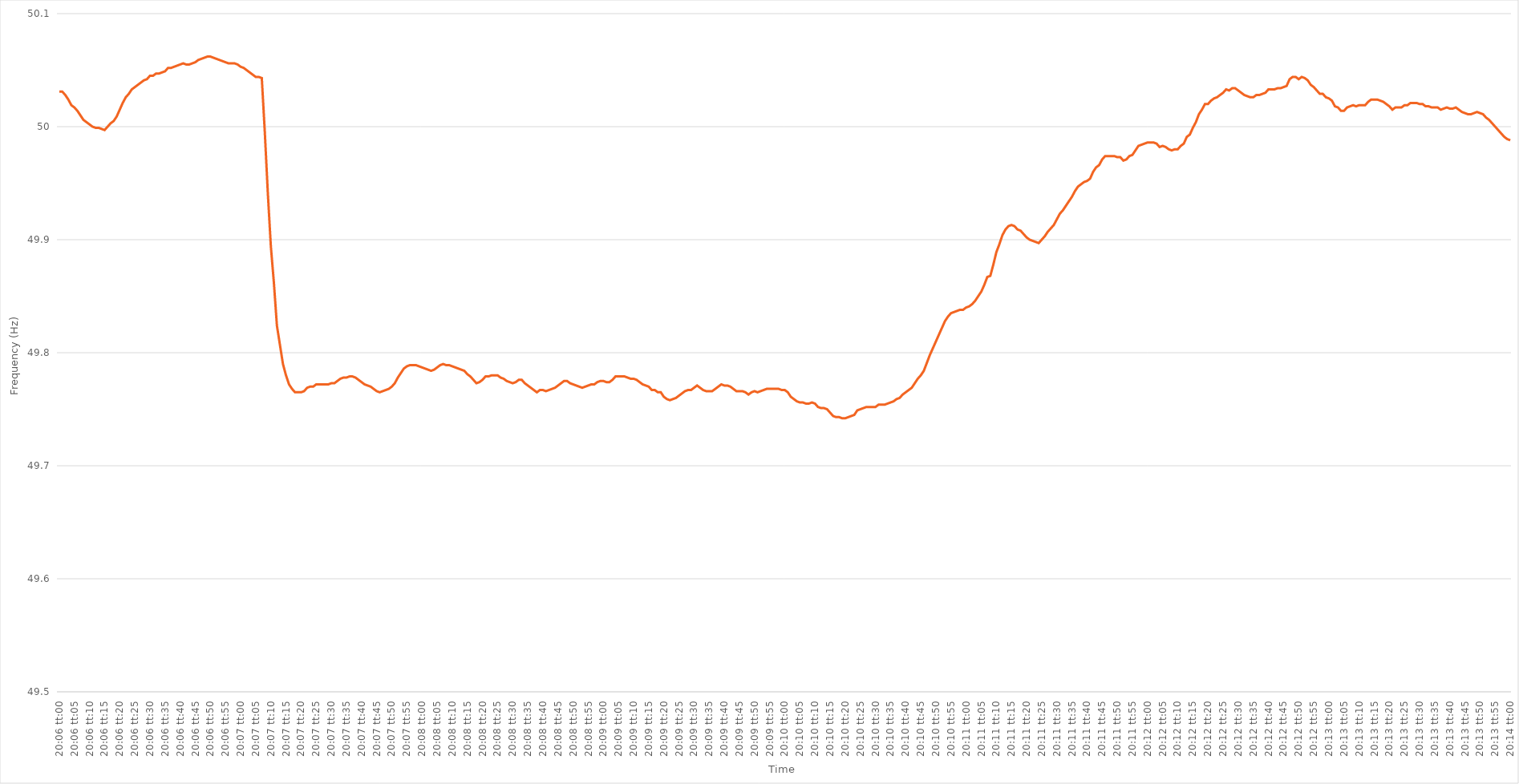
| Category | Series 0 |
|---|---|
| 0.8375 | 50.031 |
| 0.8375115740740741 | 50.031 |
| 0.8375231481481481 | 50.028 |
| 0.8375347222222222 | 50.024 |
| 0.8375462962962964 | 50.019 |
| 0.8375578703703703 | 50.017 |
| 0.8375694444444445 | 50.014 |
| 0.8375810185185185 | 50.01 |
| 0.8375925925925927 | 50.006 |
| 0.8376041666666666 | 50.004 |
| 0.8376157407407407 | 50.002 |
| 0.8376273148148149 | 50 |
| 0.8376388888888888 | 49.999 |
| 0.837650462962963 | 49.999 |
| 0.837662037037037 | 49.998 |
| 0.8376736111111112 | 49.997 |
| 0.8376851851851851 | 50 |
| 0.8376967592592592 | 50.003 |
| 0.8377083333333334 | 50.005 |
| 0.8377199074074074 | 50.009 |
| 0.8377314814814815 | 50.015 |
| 0.8377430555555555 | 50.021 |
| 0.8377546296296297 | 50.026 |
| 0.8377662037037038 | 50.029 |
| 0.8377777777777777 | 50.033 |
| 0.8377893518518519 | 50.035 |
| 0.8378009259259259 | 50.037 |
| 0.8378125000000001 | 50.039 |
| 0.837824074074074 | 50.041 |
| 0.8378356481481481 | 50.042 |
| 0.8378472222222223 | 50.045 |
| 0.8378587962962962 | 50.045 |
| 0.8378703703703704 | 50.047 |
| 0.8378819444444444 | 50.047 |
| 0.8378935185185186 | 50.048 |
| 0.8379050925925925 | 50.049 |
| 0.8379166666666666 | 50.052 |
| 0.8379282407407408 | 50.052 |
| 0.8379398148148148 | 50.053 |
| 0.8379513888888889 | 50.054 |
| 0.8379629629629629 | 50.055 |
| 0.8379745370370371 | 50.056 |
| 0.8379861111111112 | 50.055 |
| 0.8379976851851851 | 50.055 |
| 0.8380092592592593 | 50.056 |
| 0.8380208333333333 | 50.057 |
| 0.8380324074074075 | 50.059 |
| 0.8380439814814814 | 50.06 |
| 0.8380555555555556 | 50.061 |
| 0.8380671296296297 | 50.062 |
| 0.8380787037037036 | 50.062 |
| 0.8380902777777778 | 50.061 |
| 0.8381018518518518 | 50.06 |
| 0.838113425925926 | 50.059 |
| 0.8381249999999999 | 50.058 |
| 0.838136574074074 | 50.057 |
| 0.8381481481481482 | 50.056 |
| 0.8381597222222222 | 50.056 |
| 0.8381712962962963 | 50.056 |
| 0.8381828703703703 | 50.055 |
| 0.8381944444444445 | 50.053 |
| 0.8382060185185186 | 50.052 |
| 0.8382175925925925 | 50.05 |
| 0.8382291666666667 | 50.048 |
| 0.8382407407407407 | 50.046 |
| 0.8382523148148149 | 50.044 |
| 0.8382638888888888 | 50.044 |
| 0.838275462962963 | 50.043 |
| 0.8382870370370371 | 49.995 |
| 0.8382986111111111 | 49.941 |
| 0.8383101851851852 | 49.894 |
| 0.8383217592592592 | 49.862 |
| 0.8383333333333334 | 49.824 |
| 0.8383449074074073 | 49.807 |
| 0.8383564814814815 | 49.79 |
| 0.8383680555555556 | 49.78 |
| 0.8383796296296296 | 49.772 |
| 0.8383912037037037 | 49.768 |
| 0.8384027777777777 | 49.765 |
| 0.8384143518518519 | 49.765 |
| 0.838425925925926 | 49.765 |
| 0.8384375 | 49.766 |
| 0.8384490740740741 | 49.769 |
| 0.8384606481481481 | 49.77 |
| 0.8384722222222223 | 49.77 |
| 0.8384837962962962 | 49.772 |
| 0.8384953703703704 | 49.772 |
| 0.8385069444444445 | 49.772 |
| 0.8385185185185186 | 49.772 |
| 0.8385300925925926 | 49.772 |
| 0.8385416666666666 | 49.773 |
| 0.8385532407407408 | 49.773 |
| 0.8385648148148147 | 49.775 |
| 0.8385763888888889 | 49.777 |
| 0.838587962962963 | 49.778 |
| 0.838599537037037 | 49.778 |
| 0.8386111111111111 | 49.779 |
| 0.8386226851851851 | 49.779 |
| 0.8386342592592593 | 49.778 |
| 0.8386458333333334 | 49.776 |
| 0.8386574074074074 | 49.774 |
| 0.8386689814814815 | 49.772 |
| 0.8386805555555555 | 49.771 |
| 0.8386921296296297 | 49.77 |
| 0.8387037037037036 | 49.768 |
| 0.8387152777777778 | 49.766 |
| 0.8387268518518519 | 49.765 |
| 0.838738425925926 | 49.766 |
| 0.83875 | 49.767 |
| 0.838761574074074 | 49.768 |
| 0.8387731481481482 | 49.77 |
| 0.8387847222222221 | 49.773 |
| 0.8387962962962963 | 49.778 |
| 0.8388078703703704 | 49.782 |
| 0.8388194444444445 | 49.786 |
| 0.8388310185185185 | 49.788 |
| 0.8388425925925925 | 49.789 |
| 0.8388541666666667 | 49.789 |
| 0.8388657407407408 | 49.789 |
| 0.8388773148148148 | 49.788 |
| 0.8388888888888889 | 49.787 |
| 0.838900462962963 | 49.786 |
| 0.8389120370370371 | 49.785 |
| 0.838923611111111 | 49.784 |
| 0.8389351851851852 | 49.785 |
| 0.8389467592592593 | 49.787 |
| 0.8389583333333334 | 49.789 |
| 0.8389699074074074 | 49.79 |
| 0.8389814814814814 | 49.789 |
| 0.8389930555555556 | 49.789 |
| 0.8390046296296297 | 49.788 |
| 0.8390162037037037 | 49.787 |
| 0.8390277777777778 | 49.786 |
| 0.8390393518518519 | 49.785 |
| 0.8390509259259259 | 49.784 |
| 0.8390624999999999 | 49.781 |
| 0.8390740740740741 | 49.779 |
| 0.8390856481481482 | 49.776 |
| 0.8390972222222222 | 49.773 |
| 0.8391087962962963 | 49.774 |
| 0.8391203703703703 | 49.776 |
| 0.8391319444444445 | 49.779 |
| 0.8391435185185184 | 49.779 |
| 0.8391550925925926 | 49.78 |
| 0.8391666666666667 | 49.78 |
| 0.8391782407407408 | 49.78 |
| 0.8391898148148148 | 49.778 |
| 0.8392013888888888 | 49.777 |
| 0.839212962962963 | 49.775 |
| 0.8392245370370371 | 49.774 |
| 0.8392361111111111 | 49.773 |
| 0.8392476851851852 | 49.774 |
| 0.8392592592592593 | 49.776 |
| 0.8392708333333333 | 49.776 |
| 0.8392824074074073 | 49.773 |
| 0.8392939814814815 | 49.771 |
| 0.8393055555555556 | 49.769 |
| 0.8393171296296296 | 49.767 |
| 0.8393287037037037 | 49.765 |
| 0.8393402777777778 | 49.767 |
| 0.8393518518518519 | 49.767 |
| 0.8393634259259258 | 49.766 |
| 0.839375 | 49.767 |
| 0.8393865740740741 | 49.768 |
| 0.8393981481481482 | 49.769 |
| 0.8394097222222222 | 49.771 |
| 0.8394212962962962 | 49.773 |
| 0.8394328703703704 | 49.775 |
| 0.8394444444444445 | 49.775 |
| 0.8394560185185185 | 49.773 |
| 0.8394675925925926 | 49.772 |
| 0.8394791666666667 | 49.771 |
| 0.8394907407407407 | 49.77 |
| 0.8395023148148147 | 49.769 |
| 0.8395138888888889 | 49.77 |
| 0.839525462962963 | 49.771 |
| 0.839537037037037 | 49.772 |
| 0.8395486111111111 | 49.772 |
| 0.8395601851851852 | 49.774 |
| 0.8395717592592593 | 49.775 |
| 0.8395833333333332 | 49.775 |
| 0.8395949074074074 | 49.774 |
| 0.8396064814814815 | 49.774 |
| 0.8396180555555556 | 49.776 |
| 0.8396296296296296 | 49.779 |
| 0.8396412037037037 | 49.779 |
| 0.8396527777777778 | 49.779 |
| 0.839664351851852 | 49.779 |
| 0.8396759259259259 | 49.778 |
| 0.8396875 | 49.777 |
| 0.8396990740740741 | 49.777 |
| 0.8397106481481482 | 49.776 |
| 0.8397222222222221 | 49.774 |
| 0.8397337962962963 | 49.772 |
| 0.8397453703703704 | 49.771 |
| 0.8397569444444444 | 49.77 |
| 0.8397685185185185 | 49.767 |
| 0.8397800925925926 | 49.767 |
| 0.8397916666666667 | 49.765 |
| 0.8398032407407406 | 49.765 |
| 0.8398148148148148 | 49.761 |
| 0.8398263888888889 | 49.759 |
| 0.839837962962963 | 49.758 |
| 0.839849537037037 | 49.759 |
| 0.8398611111111111 | 49.76 |
| 0.8398726851851852 | 49.762 |
| 0.8398842592592594 | 49.764 |
| 0.8398958333333333 | 49.766 |
| 0.8399074074074074 | 49.767 |
| 0.8399189814814815 | 49.767 |
| 0.8399305555555556 | 49.769 |
| 0.8399421296296296 | 49.771 |
| 0.8399537037037037 | 49.769 |
| 0.8399652777777779 | 49.767 |
| 0.8399768518518518 | 49.766 |
| 0.8399884259259259 | 49.766 |
| 0.84 | 49.766 |
| 0.8400115740740741 | 49.768 |
| 0.840023148148148 | 49.77 |
| 0.8400347222222222 | 49.772 |
| 0.8400462962962963 | 49.771 |
| 0.8400578703703704 | 49.771 |
| 0.8400694444444444 | 49.77 |
| 0.8400810185185185 | 49.768 |
| 0.8400925925925926 | 49.766 |
| 0.8401041666666668 | 49.766 |
| 0.8401157407407407 | 49.766 |
| 0.8401273148148148 | 49.765 |
| 0.8401388888888889 | 49.763 |
| 0.840150462962963 | 49.765 |
| 0.840162037037037 | 49.766 |
| 0.8401736111111111 | 49.765 |
| 0.8401851851851853 | 49.766 |
| 0.8401967592592593 | 49.767 |
| 0.8402083333333333 | 49.768 |
| 0.8402199074074074 | 49.768 |
| 0.8402314814814815 | 49.768 |
| 0.8402430555555555 | 49.768 |
| 0.8402546296296296 | 49.768 |
| 0.8402662037037038 | 49.767 |
| 0.8402777777777778 | 49.767 |
| 0.8402893518518518 | 49.765 |
| 0.8403009259259259 | 49.761 |
| 0.8403125 | 49.759 |
| 0.8403240740740742 | 49.757 |
| 0.8403356481481481 | 49.756 |
| 0.8403472222222222 | 49.756 |
| 0.8403587962962963 | 49.755 |
| 0.8403703703703704 | 49.755 |
| 0.8403819444444444 | 49.756 |
| 0.8403935185185185 | 49.755 |
| 0.8404050925925927 | 49.752 |
| 0.8404166666666667 | 49.751 |
| 0.8404282407407407 | 49.751 |
| 0.8404398148148148 | 49.75 |
| 0.8404513888888889 | 49.747 |
| 0.8404629629629629 | 49.744 |
| 0.840474537037037 | 49.743 |
| 0.8404861111111112 | 49.743 |
| 0.8404976851851852 | 49.742 |
| 0.8405092592592592 | 49.742 |
| 0.8405208333333333 | 49.743 |
| 0.8405324074074074 | 49.744 |
| 0.8405439814814816 | 49.745 |
| 0.8405555555555555 | 49.749 |
| 0.8405671296296297 | 49.75 |
| 0.8405787037037037 | 49.751 |
| 0.8405902777777778 | 49.752 |
| 0.8406018518518518 | 49.752 |
| 0.8406134259259259 | 49.752 |
| 0.8406250000000001 | 49.752 |
| 0.8406365740740741 | 49.754 |
| 0.8406481481481481 | 49.754 |
| 0.8406597222222222 | 49.754 |
| 0.8406712962962963 | 49.755 |
| 0.8406828703703703 | 49.756 |
| 0.8406944444444444 | 49.757 |
| 0.8407060185185186 | 49.759 |
| 0.8407175925925926 | 49.76 |
| 0.8407291666666666 | 49.763 |
| 0.8407407407407407 | 49.765 |
| 0.8407523148148148 | 49.767 |
| 0.840763888888889 | 49.769 |
| 0.8407754629629629 | 49.773 |
| 0.840787037037037 | 49.777 |
| 0.8407986111111111 | 49.78 |
| 0.8408101851851852 | 49.784 |
| 0.8408217592592592 | 49.791 |
| 0.8408333333333333 | 49.798 |
| 0.8408449074074075 | 49.804 |
| 0.8408564814814815 | 49.81 |
| 0.8408680555555555 | 49.816 |
| 0.8408796296296296 | 49.822 |
| 0.8408912037037037 | 49.828 |
| 0.8409027777777779 | 49.832 |
| 0.8409143518518518 | 49.835 |
| 0.840925925925926 | 49.836 |
| 0.8409375 | 49.837 |
| 0.840949074074074 | 49.838 |
| 0.8409606481481481 | 49.838 |
| 0.8409722222222222 | 49.84 |
| 0.8409837962962964 | 49.841 |
| 0.8409953703703703 | 49.843 |
| 0.8410069444444445 | 49.846 |
| 0.8410185185185185 | 49.85 |
| 0.8410300925925926 | 49.854 |
| 0.8410416666666666 | 49.86 |
| 0.8410532407407407 | 49.867 |
| 0.8410648148148149 | 49.868 |
| 0.8410763888888889 | 49.878 |
| 0.841087962962963 | 49.889 |
| 0.841099537037037 | 49.896 |
| 0.8411111111111111 | 49.904 |
| 0.8411226851851853 | 49.909 |
| 0.8411342592592592 | 49.912 |
| 0.8411458333333334 | 49.913 |
| 0.8411574074074074 | 49.912 |
| 0.8411689814814814 | 49.909 |
| 0.8411805555555555 | 49.908 |
| 0.8411921296296296 | 49.905 |
| 0.8412037037037038 | 49.902 |
| 0.8412152777777777 | 49.9 |
| 0.8412268518518519 | 49.899 |
| 0.8412384259259259 | 49.898 |
| 0.84125 | 49.897 |
| 0.841261574074074 | 49.9 |
| 0.8412731481481481 | 49.903 |
| 0.8412847222222223 | 49.907 |
| 0.8412962962962963 | 49.91 |
| 0.8413078703703704 | 49.913 |
| 0.8413194444444444 | 49.918 |
| 0.8413310185185185 | 49.923 |
| 0.8413425925925927 | 49.926 |
| 0.8413541666666666 | 49.93 |
| 0.8413657407407408 | 49.934 |
| 0.8413773148148148 | 49.938 |
| 0.8413888888888889 | 49.943 |
| 0.8414004629629629 | 49.947 |
| 0.841412037037037 | 49.949 |
| 0.8414236111111112 | 49.951 |
| 0.8414351851851851 | 49.952 |
| 0.8414467592592593 | 49.954 |
| 0.8414583333333333 | 49.96 |
| 0.8414699074074075 | 49.964 |
| 0.8414814814814814 | 49.966 |
| 0.8414930555555555 | 49.971 |
| 0.8415046296296297 | 49.974 |
| 0.8415162037037037 | 49.974 |
| 0.8415277777777778 | 49.974 |
| 0.8415393518518518 | 49.974 |
| 0.841550925925926 | 49.973 |
| 0.8415625000000001 | 49.973 |
| 0.841574074074074 | 49.97 |
| 0.8415856481481482 | 49.971 |
| 0.8415972222222222 | 49.974 |
| 0.8416087962962964 | 49.975 |
| 0.8416203703703703 | 49.979 |
| 0.8416319444444444 | 49.983 |
| 0.8416435185185186 | 49.984 |
| 0.8416550925925925 | 49.985 |
| 0.8416666666666667 | 49.986 |
| 0.8416782407407407 | 49.986 |
| 0.8416898148148149 | 49.986 |
| 0.8417013888888888 | 49.985 |
| 0.8417129629629629 | 49.982 |
| 0.8417245370370371 | 49.983 |
| 0.8417361111111111 | 49.982 |
| 0.8417476851851852 | 49.98 |
| 0.8417592592592592 | 49.979 |
| 0.8417708333333334 | 49.98 |
| 0.8417824074074075 | 49.98 |
| 0.8417939814814814 | 49.983 |
| 0.8418055555555556 | 49.985 |
| 0.8418171296296296 | 49.991 |
| 0.8418287037037038 | 49.993 |
| 0.8418402777777777 | 49.999 |
| 0.8418518518518519 | 50.004 |
| 0.841863425925926 | 50.011 |
| 0.8418749999999999 | 50.015 |
| 0.8418865740740741 | 50.02 |
| 0.8418981481481481 | 50.02 |
| 0.8419097222222223 | 50.023 |
| 0.8419212962962962 | 50.025 |
| 0.8419328703703703 | 50.026 |
| 0.8419444444444445 | 50.028 |
| 0.8419560185185185 | 50.03 |
| 0.8419675925925926 | 50.033 |
| 0.8419791666666666 | 50.032 |
| 0.8419907407407408 | 50.034 |
| 0.8420023148148149 | 50.034 |
| 0.8420138888888888 | 50.032 |
| 0.842025462962963 | 50.03 |
| 0.842037037037037 | 50.028 |
| 0.8420486111111112 | 50.027 |
| 0.8420601851851851 | 50.026 |
| 0.8420717592592593 | 50.026 |
| 0.8420833333333334 | 50.028 |
| 0.8420949074074073 | 50.028 |
| 0.8421064814814815 | 50.029 |
| 0.8421180555555555 | 50.03 |
| 0.8421296296296297 | 50.033 |
| 0.8421412037037036 | 50.033 |
| 0.8421527777777778 | 50.033 |
| 0.8421643518518519 | 50.034 |
| 0.8421759259259259 | 50.034 |
| 0.8421875 | 50.035 |
| 0.842199074074074 | 50.036 |
| 0.8422106481481482 | 50.042 |
| 0.8422222222222223 | 50.044 |
| 0.8422337962962962 | 50.044 |
| 0.8422453703703704 | 50.042 |
| 0.8422569444444444 | 50.044 |
| 0.8422685185185186 | 50.043 |
| 0.8422800925925925 | 50.041 |
| 0.8422916666666667 | 50.037 |
| 0.8423032407407408 | 50.035 |
| 0.8423148148148148 | 50.032 |
| 0.8423263888888889 | 50.029 |
| 0.8423379629629629 | 50.029 |
| 0.8423495370370371 | 50.026 |
| 0.842361111111111 | 50.025 |
| 0.8423726851851852 | 50.023 |
| 0.8423842592592593 | 50.018 |
| 0.8423958333333333 | 50.017 |
| 0.8424074074074074 | 50.014 |
| 0.8424189814814814 | 50.014 |
| 0.8424305555555556 | 50.017 |
| 0.8424421296296297 | 50.018 |
| 0.8424537037037036 | 50.019 |
| 0.8424652777777778 | 50.018 |
| 0.8424768518518518 | 50.019 |
| 0.842488425925926 | 50.019 |
| 0.8424999999999999 | 50.019 |
| 0.8425115740740741 | 50.022 |
| 0.8425231481481482 | 50.024 |
| 0.8425347222222223 | 50.024 |
| 0.8425462962962963 | 50.024 |
| 0.8425578703703703 | 50.023 |
| 0.8425694444444445 | 50.022 |
| 0.8425810185185184 | 50.02 |
| 0.8425925925925926 | 50.018 |
| 0.8426041666666667 | 50.015 |
| 0.8426157407407407 | 50.017 |
| 0.8426273148148148 | 50.017 |
| 0.8426388888888888 | 50.017 |
| 0.842650462962963 | 50.019 |
| 0.8426620370370371 | 50.019 |
| 0.842673611111111 | 50.021 |
| 0.8426851851851852 | 50.021 |
| 0.8426967592592592 | 50.021 |
| 0.8427083333333334 | 50.02 |
| 0.8427199074074073 | 50.02 |
| 0.8427314814814815 | 50.018 |
| 0.8427430555555556 | 50.018 |
| 0.8427546296296297 | 50.017 |
| 0.8427662037037037 | 50.017 |
| 0.8427777777777777 | 50.017 |
| 0.8427893518518519 | 50.015 |
| 0.842800925925926 | 50.016 |
| 0.8428125 | 50.017 |
| 0.8428240740740741 | 50.016 |
| 0.8428356481481482 | 50.016 |
| 0.8428472222222222 | 50.017 |
| 0.8428587962962962 | 50.015 |
| 0.8428703703703704 | 50.013 |
| 0.8428819444444445 | 50.012 |
| 0.8428935185185185 | 50.011 |
| 0.8429050925925926 | 50.011 |
| 0.8429166666666666 | 50.012 |
| 0.8429282407407408 | 50.013 |
| 0.8429398148148147 | 50.012 |
| 0.8429513888888889 | 50.011 |
| 0.842962962962963 | 50.008 |
| 0.8429745370370371 | 50.006 |
| 0.8429861111111111 | 50.003 |
| 0.8429976851851851 | 50 |
| 0.8430092592592593 | 49.997 |
| 0.8430208333333334 | 49.994 |
| 0.8430324074074074 | 49.991 |
| 0.8430439814814815 | 49.989 |
| 0.8430555555555556 | 49.988 |